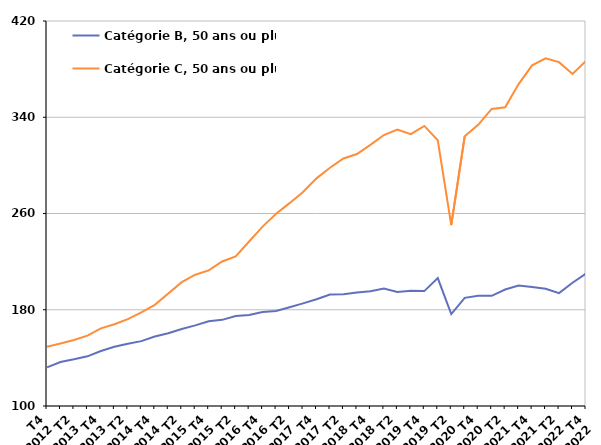
| Category | Catégorie B, 50 ans ou plus | Catégorie C, 50 ans ou plus |
|---|---|---|
| T4
2012 | 132.1 | 149.2 |
| T1
2013 | 136.6 | 151.9 |
| T2
2013 | 138.8 | 154.8 |
| T3
2013 | 141.3 | 158.5 |
| T4
2013 | 145.7 | 164.5 |
| T1
2014 | 149.2 | 167.9 |
| T2
2014 | 151.8 | 172.2 |
| T3
2014 | 153.9 | 177.8 |
| T4
2014 | 157.8 | 184.1 |
| T1
2015 | 160.5 | 193.5 |
| T2
2015 | 164 | 202.9 |
| T3
2015 | 167 | 209.1 |
| T4
2015 | 170.4 | 212.7 |
| T1
2016 | 171.6 | 220.1 |
| T2
2016 | 174.8 | 224.3 |
| T3
2016 | 175.6 | 236.7 |
| T4
2016 | 178.2 | 249.1 |
| T1
2017 | 179 | 259.8 |
| T2
2017 | 182.1 | 268.6 |
| T3
2017 | 185.3 | 277.9 |
| T4
2017 | 188.7 | 289.2 |
| T1
2018 | 192.7 | 298 |
| T2
2018 | 192.8 | 305.7 |
| T3
2018 | 194.3 | 309.4 |
| T4
2018 | 195.4 | 317 |
| T1
2019 | 197.6 | 325.2 |
| T2
2019 | 194.8 | 329.7 |
| T3
2019 | 195.8 | 325.9 |
| T4
2019 | 195.5 | 332.8 |
| T1
2020 | 206.3 | 320.9 |
| T2
2020 | 176.4 | 250.3 |
| T3
2020 | 189.9 | 324.2 |
| T4
2020 | 191.6 | 333.7 |
| T1
2021 | 191.6 | 346.9 |
| T2
2021 | 196.8 | 348.3 |
| T3
2021 | 200.1 | 367.6 |
| T4
2021 | 199 | 383.1 |
| T1
2022 | 197.5 | 389 |
| T2
2022 | 193.8 | 385.8 |
| T3
2022 | 202.4 | 376 |
| T4
2022 | 210.1 | 386.9 |